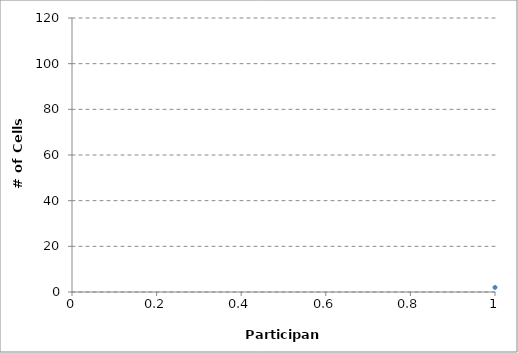
| Category | Series 0 |
|---|---|
| 0 | 2 |
| 1 | 5 |
| 2 | 5 |
| 3 | 10 |
| 4 | 10 |
| 5 | 14 |
| 6 | 14 |
| 7 | 15 |
| 8 | 15 |
| 9 | 16 |
| 10 | 22 |
| 11 | 25 |
| 12 | 25 |
| 13 | 31 |
| 14 | 34 |
| 15 | 35 |
| 16 | 44 |
| 17 | 44 |
| 18 | 47 |
| 19 | 50 |
| 20 | 57 |
| 21 | 72 |
| 22 | 79 |
| 23 | 80 |
| 24 | 80 |
| 25 | 80 |
| 26 | 82 |
| 27 | 82 |
| 28 | 82 |
| 29 | 83 |
| 30 | 83 |
| 31 | 83 |
| 32 | 83 |
| 33 | 83 |
| 34 | 83 |
| 35 | 84 |
| 36 | 84 |
| 37 | 84 |
| 38 | 84 |
| 39 | 84 |
| 40 | 85 |
| 41 | 85 |
| 42 | 85 |
| 43 | 85 |
| 44 | 85 |
| 45 | 85 |
| 46 | 85 |
| 47 | 85 |
| 48 | 85 |
| 49 | 85 |
| 50 | 85 |
| 51 | 85 |
| 52 | 85 |
| 53 | 85 |
| 54 | 85 |
| 55 | 85 |
| 56 | 85 |
| 57 | 85 |
| 58 | 85 |
| 59 | 86 |
| 60 | 86 |
| 61 | 86 |
| 62 | 86 |
| 63 | 86 |
| 64 | 86 |
| 65 | 86 |
| 66 | 86 |
| 67 | 86 |
| 68 | 86 |
| 69 | 86 |
| 70 | 86 |
| 71 | 86 |
| 72 | 87 |
| 73 | 87 |
| 74 | 87 |
| 75 | 87 |
| 76 | 87 |
| 77 | 87 |
| 78 | 87 |
| 79 | 87 |
| 80 | 87 |
| 81 | 87 |
| 82 | 87 |
| 83 | 87 |
| 84 | 87 |
| 85 | 87 |
| 86 | 87 |
| 87 | 87 |
| 88 | 87 |
| 89 | 87 |
| 90 | 87 |
| 91 | 87 |
| 92 | 87 |
| 93 | 87 |
| 94 | 87 |
| 95 | 87 |
| 96 | 87 |
| 97 | 87 |
| 98 | 87 |
| 99 | 87 |
| 100 | 87 |
| 101 | 87 |
| 102 | 87 |
| 103 | 87 |
| 104 | 87 |
| 105 | 87 |
| 106 | 87 |
| 107 | 87 |
| 108 | 87 |
| 109 | 87 |
| 110 | 87 |
| 111 | 87 |
| 112 | 87 |
| 113 | 87 |
| 114 | 87 |
| 115 | 87 |
| 116 | 87 |
| 117 | 88 |
| 118 | 88 |
| 119 | 88 |
| 120 | 88 |
| 121 | 88 |
| 122 | 88 |
| 123 | 88 |
| 124 | 88 |
| 125 | 88 |
| 126 | 88 |
| 127 | 88 |
| 128 | 88 |
| 129 | 88 |
| 130 | 88 |
| 131 | 88 |
| 132 | 89 |
| 133 | 89 |
| 134 | 89 |
| 135 | 89 |
| 136 | 89 |
| 137 | 89 |
| 138 | 89 |
| 139 | 89 |
| 140 | 89 |
| 141 | 89 |
| 142 | 89 |
| 143 | 89 |
| 144 | 89 |
| 145 | 89 |
| 146 | 89 |
| 147 | 89 |
| 148 | 89 |
| 149 | 89 |
| 150 | 89 |
| 151 | 89 |
| 152 | 89 |
| 153 | 89 |
| 154 | 89 |
| 155 | 89 |
| 156 | 89 |
| 157 | 89 |
| 158 | 89 |
| 159 | 89 |
| 160 | 89 |
| 161 | 89 |
| 162 | 89 |
| 163 | 89 |
| 164 | 89 |
| 165 | 89 |
| 166 | 89 |
| 167 | 90 |
| 168 | 90 |
| 169 | 90 |
| 170 | 90 |
| 171 | 90 |
| 172 | 90 |
| 173 | 90 |
| 174 | 90 |
| 175 | 90 |
| 176 | 90 |
| 177 | 90 |
| 178 | 90 |
| 179 | 90 |
| 180 | 90 |
| 181 | 90 |
| 182 | 90 |
| 183 | 90 |
| 184 | 90 |
| 185 | 90 |
| 186 | 90 |
| 187 | 90 |
| 188 | 90 |
| 189 | 90 |
| 190 | 90 |
| 191 | 90 |
| 192 | 90 |
| 193 | 90 |
| 194 | 90 |
| 195 | 90 |
| 196 | 90 |
| 197 | 90 |
| 198 | 90 |
| 199 | 91 |
| 200 | 91 |
| 201 | 91 |
| 202 | 91 |
| 203 | 91 |
| 204 | 91 |
| 205 | 91 |
| 206 | 91 |
| 207 | 91 |
| 208 | 91 |
| 209 | 91 |
| 210 | 91 |
| 211 | 91 |
| 212 | 91 |
| 213 | 91 |
| 214 | 91 |
| 215 | 91 |
| 216 | 91 |
| 217 | 91 |
| 218 | 91 |
| 219 | 91 |
| 220 | 91 |
| 221 | 91 |
| 222 | 91 |
| 223 | 91 |
| 224 | 91 |
| 225 | 91 |
| 226 | 91 |
| 227 | 91 |
| 228 | 91 |
| 229 | 92 |
| 230 | 92 |
| 231 | 92 |
| 232 | 92 |
| 233 | 92 |
| 234 | 92 |
| 235 | 92 |
| 236 | 92 |
| 237 | 92 |
| 238 | 92 |
| 239 | 92 |
| 240 | 92 |
| 241 | 92 |
| 242 | 92 |
| 243 | 92 |
| 244 | 92 |
| 245 | 92 |
| 246 | 92 |
| 247 | 92 |
| 248 | 92 |
| 249 | 92 |
| 250 | 92 |
| 251 | 92 |
| 252 | 92 |
| 253 | 92 |
| 254 | 92 |
| 255 | 92 |
| 256 | 92 |
| 257 | 92 |
| 258 | 92 |
| 259 | 92 |
| 260 | 92 |
| 261 | 92 |
| 262 | 92 |
| 263 | 92 |
| 264 | 92 |
| 265 | 92 |
| 266 | 92 |
| 267 | 92 |
| 268 | 93 |
| 269 | 93 |
| 270 | 93 |
| 271 | 93 |
| 272 | 93 |
| 273 | 93 |
| 274 | 93 |
| 275 | 93 |
| 276 | 93 |
| 277 | 93 |
| 278 | 93 |
| 279 | 93 |
| 280 | 93 |
| 281 | 93 |
| 282 | 93 |
| 283 | 93 |
| 284 | 93 |
| 285 | 93 |
| 286 | 93 |
| 287 | 93 |
| 288 | 93 |
| 289 | 93 |
| 290 | 93 |
| 291 | 93 |
| 292 | 93 |
| 293 | 93 |
| 294 | 93 |
| 295 | 93 |
| 296 | 93 |
| 297 | 93 |
| 298 | 93 |
| 299 | 93 |
| 300 | 93 |
| 301 | 93 |
| 302 | 93 |
| 303 | 93 |
| 304 | 93 |
| 305 | 93 |
| 306 | 93 |
| 307 | 93 |
| 308 | 93 |
| 309 | 93 |
| 310 | 93 |
| 311 | 93 |
| 312 | 93 |
| 313 | 93 |
| 314 | 93 |
| 315 | 93 |
| 316 | 93 |
| 317 | 93 |
| 318 | 93 |
| 319 | 93 |
| 320 | 93 |
| 321 | 93 |
| 322 | 93 |
| 323 | 93 |
| 324 | 93 |
| 325 | 93 |
| 326 | 93 |
| 327 | 93 |
| 328 | 93 |
| 329 | 93 |
| 330 | 93 |
| 331 | 93 |
| 332 | 93 |
| 333 | 93 |
| 334 | 93 |
| 335 | 93 |
| 336 | 93 |
| 337 | 93 |
| 338 | 93 |
| 339 | 93 |
| 340 | 93 |
| 341 | 93 |
| 342 | 93 |
| 343 | 93 |
| 344 | 93 |
| 345 | 93 |
| 346 | 93 |
| 347 | 93 |
| 348 | 93 |
| 349 | 93 |
| 350 | 93 |
| 351 | 93 |
| 352 | 93 |
| 353 | 93 |
| 354 | 93 |
| 355 | 93 |
| 356 | 93 |
| 357 | 93 |
| 358 | 93 |
| 359 | 93 |
| 360 | 93 |
| 361 | 93 |
| 362 | 93 |
| 363 | 93 |
| 364 | 93 |
| 365 | 93 |
| 366 | 93 |
| 367 | 93 |
| 368 | 93 |
| 369 | 93 |
| 370 | 93 |
| 371 | 93 |
| 372 | 93 |
| 373 | 93 |
| 374 | 93 |
| 375 | 93 |
| 376 | 93 |
| 377 | 93 |
| 378 | 93 |
| 379 | 93 |
| 380 | 93 |
| 381 | 93 |
| 382 | 93 |
| 383 | 93 |
| 384 | 93 |
| 385 | 93 |
| 386 | 93 |
| 387 | 93 |
| 388 | 93 |
| 389 | 93 |
| 390 | 93 |
| 391 | 93 |
| 392 | 93 |
| 393 | 93 |
| 394 | 93 |
| 395 | 93 |
| 396 | 93 |
| 397 | 94 |
| 398 | 94 |
| 399 | 94 |
| 400 | 94 |
| 401 | 94 |
| 402 | 94 |
| 403 | 94 |
| 404 | 94 |
| 405 | 94 |
| 406 | 94 |
| 407 | 94 |
| 408 | 94 |
| 409 | 94 |
| 410 | 94 |
| 411 | 94 |
| 412 | 94 |
| 413 | 94 |
| 414 | 94 |
| 415 | 94 |
| 416 | 94 |
| 417 | 94 |
| 418 | 94 |
| 419 | 94 |
| 420 | 94 |
| 421 | 94 |
| 422 | 94 |
| 423 | 94 |
| 424 | 94 |
| 425 | 94 |
| 426 | 94 |
| 427 | 94 |
| 428 | 94 |
| 429 | 94 |
| 430 | 94 |
| 431 | 94 |
| 432 | 94 |
| 433 | 94 |
| 434 | 94 |
| 435 | 94 |
| 436 | 94 |
| 437 | 94 |
| 438 | 94 |
| 439 | 94 |
| 440 | 94 |
| 441 | 94 |
| 442 | 94 |
| 443 | 94 |
| 444 | 94 |
| 445 | 94 |
| 446 | 94 |
| 447 | 94 |
| 448 | 94 |
| 449 | 94 |
| 450 | 94 |
| 451 | 94 |
| 452 | 94 |
| 453 | 95 |
| 454 | 95 |
| 455 | 95 |
| 456 | 95 |
| 457 | 95 |
| 458 | 95 |
| 459 | 95 |
| 460 | 95 |
| 461 | 95 |
| 462 | 95 |
| 463 | 95 |
| 464 | 95 |
| 465 | 95 |
| 466 | 95 |
| 467 | 95 |
| 468 | 95 |
| 469 | 95 |
| 470 | 95 |
| 471 | 95 |
| 472 | 95 |
| 473 | 95 |
| 474 | 95 |
| 475 | 95 |
| 476 | 95 |
| 477 | 95 |
| 478 | 95 |
| 479 | 95 |
| 480 | 95 |
| 481 | 95 |
| 482 | 95 |
| 483 | 95 |
| 484 | 95 |
| 485 | 95 |
| 486 | 95 |
| 487 | 95 |
| 488 | 95 |
| 489 | 95 |
| 490 | 95 |
| 491 | 95 |
| 492 | 95 |
| 493 | 95 |
| 494 | 95 |
| 495 | 95 |
| 496 | 95 |
| 497 | 95 |
| 498 | 95 |
| 499 | 95 |
| 500 | 95 |
| 501 | 95 |
| 502 | 95 |
| 503 | 95 |
| 504 | 95 |
| 505 | 95 |
| 506 | 95 |
| 507 | 95 |
| 508 | 95 |
| 509 | 95 |
| 510 | 95 |
| 511 | 95 |
| 512 | 95 |
| 513 | 95 |
| 514 | 95 |
| 515 | 95 |
| 516 | 95 |
| 517 | 95 |
| 518 | 95 |
| 519 | 95 |
| 520 | 95 |
| 521 | 95 |
| 522 | 95 |
| 523 | 95 |
| 524 | 95 |
| 525 | 95 |
| 526 | 95 |
| 527 | 95 |
| 528 | 95 |
| 529 | 95 |
| 530 | 95 |
| 531 | 96 |
| 532 | 96 |
| 533 | 96 |
| 534 | 96 |
| 535 | 96 |
| 536 | 96 |
| 537 | 96 |
| 538 | 97 |
| 539 | 97 |
| 540 | 97 |
| 541 | 97 |
| 542 | 97 |
| 543 | 97 |
| 544 | 97 |
| 545 | 97 |
| 546 | 97 |
| 547 | 97 |
| 548 | 97 |
| 549 | 97 |
| 550 | 97 |
| 551 | 97 |
| 552 | 98 |
| 553 | 98 |
| 554 | 98 |
| 555 | 98 |
| 556 | 98 |
| 557 | 98 |
| 558 | 98 |
| 559 | 98 |
| 560 | 98 |
| 561 | 99 |
| 562 | 99 |
| 563 | 100 |
| 564 | 100 |
| 565 | 100 |
| 566 | 100 |
| 567 | 100 |
| 568 | 100 |
| 569 | 100 |
| 570 | 100 |
| 571 | 100 |
| 572 | 100 |
| 573 | 100 |
| 574 | 100 |
| 575 | 100 |
| 576 | 100 |
| 577 | 100 |
| 578 | 100 |
| 579 | 100 |
| 580 | 100 |
| 581 | 100 |
| 582 | 100 |
| 583 | 100 |
| 584 | 100 |
| 585 | 100 |
| 586 | 100 |
| 587 | 100 |
| 588 | 100 |
| 589 | 100 |
| 590 | 100 |
| 591 | 100 |
| 592 | 100 |
| 593 | 100 |
| 594 | 100 |
| 595 | 100 |
| 596 | 100 |
| 597 | 100 |
| 598 | 100 |
| 599 | 100 |
| 600 | 100 |
| 601 | 100 |
| 602 | 100 |
| 603 | 100 |
| 604 | 100 |
| 605 | 100 |
| 606 | 100 |
| 607 | 100 |
| 608 | 100 |
| 609 | 100 |
| 610 | 100 |
| 611 | 100 |
| 612 | 100 |
| 613 | 100 |
| 614 | 100 |
| 615 | 100 |
| 616 | 100 |
| 617 | 100 |
| 618 | 100 |
| 619 | 100 |
| 620 | 100 |
| 621 | 100 |
| 622 | 100 |
| 623 | 100 |
| 624 | 100 |
| 625 | 100 |
| 626 | 100 |
| 627 | 100 |
| 628 | 100 |
| 629 | 100 |
| 630 | 100 |
| 631 | 100 |
| 632 | 100 |
| 633 | 100 |
| 634 | 100 |
| 635 | 100 |
| 636 | 100 |
| 637 | 100 |
| 638 | 100 |
| 639 | 100 |
| 640 | 100 |
| 641 | 100 |
| 642 | 100 |
| 643 | 100 |
| 644 | 100 |
| 645 | 100 |
| 646 | 100 |
| 647 | 100 |
| 648 | 100 |
| 649 | 100 |
| 650 | 100 |
| 651 | 101 |